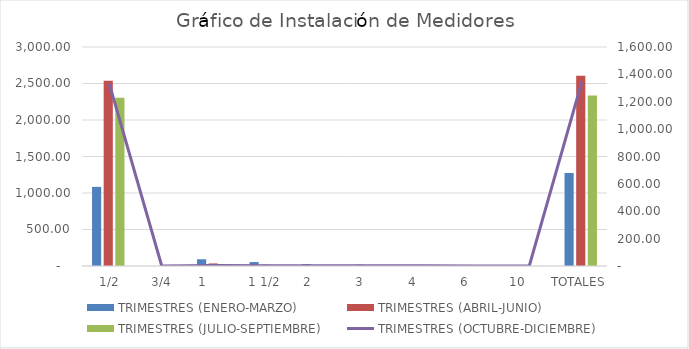
| Category | TRIMESTRES |
|---|---|
|  1/2 | 2304 |
|  3/4 | 0 |
| 1     | 26 |
| 1 1/2 | 2 |
| 2     | 2 |
| 3     | 0 |
| 4     | 2 |
| 6     | 0 |
| 10     | 1 |
| TOTALES | 2337 |